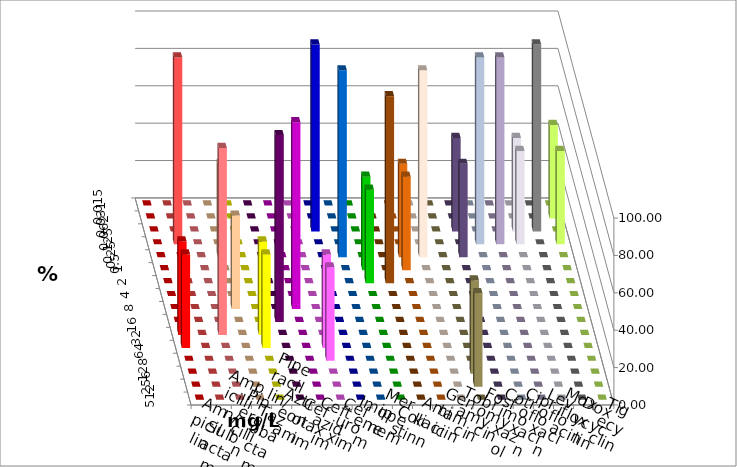
| Category | Ampicillin | Ampicillin/ Sulbactam | Piperacillin | Piperacillin/ Tazobactam | Aztreonam | Cefotaxim | Ceftazidim | Cefuroxim | Imipenem | Meropenem | Colistin | Amikacin | Gentamicin | Tobramycin | Fosfomycin | Cotrimoxazol | Ciprofloxacin | Levofloxacin | Moxifloxacin | Doxycyclin | Tigecyclin |
|---|---|---|---|---|---|---|---|---|---|---|---|---|---|---|---|---|---|---|---|---|---|
| 0.015 | 0 | 0 | 0 | 0 | 0 | 0 | 0 | 0 | 0 | 0 | 0 | 0 | 0 | 0 | 0 | 0 | 0 | 0 | 0 | 0 | 0 |
| 0.031 | 0 | 0 | 0 | 0 | 0 | 0 | 0 | 0 | 0 | 0 | 0 | 0 | 0 | 0 | 0 | 0 | 0 | 0 | 0 | 0 | 50 |
| 0.062 | 0 | 0 | 0 | 0 | 0 | 0 | 0 | 0 | 100 | 0 | 0 | 0 | 0 | 0 | 0 | 50 | 0 | 0 | 50 | 100 | 0 |
| 0.125 | 0 | 100 | 0 | 0 | 0 | 0 | 0 | 0 | 0 | 0 | 0 | 0 | 0 | 0 | 0 | 0 | 100 | 100 | 50 | 0 | 50 |
| 0.25 | 0 | 0 | 0 | 50 | 0 | 0 | 0 | 0 | 0 | 100 | 0 | 0 | 50 | 100 | 0 | 50 | 0 | 0 | 0 | 0 | 0 |
| 0.5 | 0 | 0 | 0 | 0 | 0 | 0 | 0 | 0 | 0 | 0 | 50 | 0 | 50 | 0 | 0 | 0 | 0 | 0 | 0 | 0 | 0 |
| 1.0 | 0 | 0 | 0 | 0 | 0 | 0 | 0 | 0 | 0 | 0 | 50 | 100 | 0 | 0 | 0 | 0 | 0 | 0 | 0 | 0 | 0 |
| 2.0 | 0 | 0 | 0 | 0 | 0 | 0 | 0 | 0 | 0 | 0 | 0 | 0 | 0 | 0 | 0 | 0 | 0 | 0 | 0 | 0 | 0 |
| 4.0 | 0 | 0 | 0 | 50 | 0 | 0 | 100 | 0 | 0 | 0 | 0 | 0 | 0 | 0 | 0 | 0 | 0 | 0 | 0 | 0 | 0 |
| 8.0 | 0 | 0 | 0 | 0 | 0 | 100 | 0 | 0 | 0 | 0 | 0 | 0 | 0 | 0 | 0 | 0 | 0 | 0 | 0 | 0 | 0 |
| 16.0 | 50 | 0 | 100 | 0 | 50 | 0 | 0 | 0 | 0 | 0 | 0 | 0 | 0 | 0 | 0 | 0 | 0 | 0 | 0 | 0 | 0 |
| 32.0 | 50 | 0 | 0 | 0 | 50 | 0 | 0 | 50 | 0 | 0 | 0 | 0 | 0 | 0 | 0 | 0 | 0 | 0 | 0 | 0 | 0 |
| 64.0 | 0 | 0 | 0 | 0 | 0 | 0 | 0 | 50 | 0 | 0 | 0 | 0 | 0 | 0 | 0 | 0 | 0 | 0 | 0 | 0 | 0 |
| 128.0 | 0 | 0 | 0 | 0 | 0 | 0 | 0 | 0 | 0 | 0 | 0 | 0 | 0 | 0 | 50 | 0 | 0 | 0 | 0 | 0 | 0 |
| 256.0 | 0 | 0 | 0 | 0 | 0 | 0 | 0 | 0 | 0 | 0 | 0 | 0 | 0 | 0 | 50 | 0 | 0 | 0 | 0 | 0 | 0 |
| 512.0 | 0 | 0 | 0 | 0 | 0 | 0 | 0 | 0 | 0 | 0 | 0 | 0 | 0 | 0 | 0 | 0 | 0 | 0 | 0 | 0 | 0 |